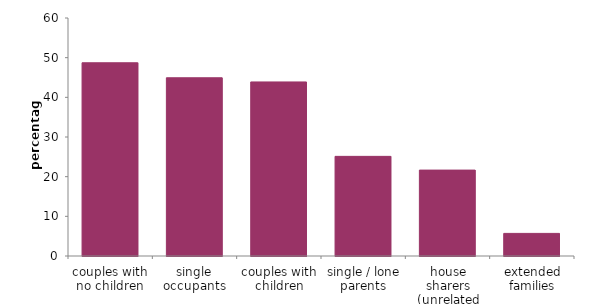
| Category | Series 0 |
|---|---|
| couples with no children | 48.713 |
| single occupants | 44.932 |
| couples with children | 43.878 |
| single / lone parents | 25.118 |
| house sharers (unrelated adults) | 21.656 |
| extended families | 5.697 |